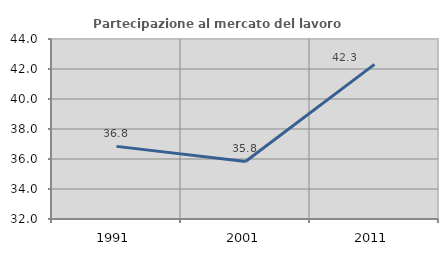
| Category | Partecipazione al mercato del lavoro  femminile |
|---|---|
| 1991.0 | 36.842 |
| 2001.0 | 35.838 |
| 2011.0 | 42.308 |